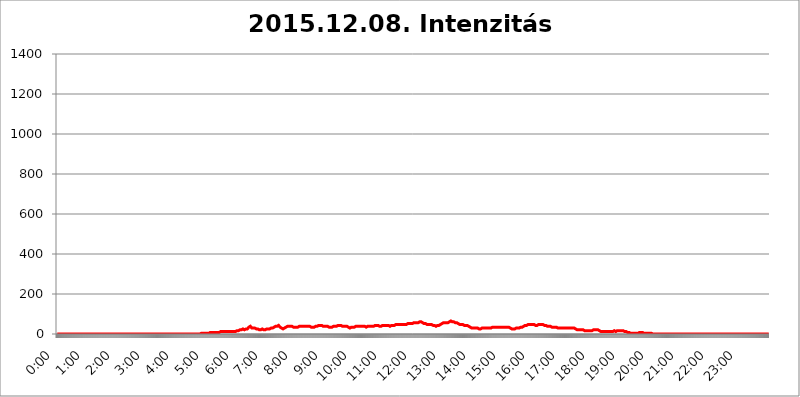
| Category | 2015.12.08. Intenzitás [W/m^2] |
|---|---|
| 0.0 | 0 |
| 0.0006944444444444445 | 0 |
| 0.001388888888888889 | 0 |
| 0.0020833333333333333 | 0 |
| 0.002777777777777778 | 0 |
| 0.003472222222222222 | 0 |
| 0.004166666666666667 | 0 |
| 0.004861111111111111 | 0 |
| 0.005555555555555556 | 0 |
| 0.0062499999999999995 | 0 |
| 0.006944444444444444 | 0 |
| 0.007638888888888889 | 0 |
| 0.008333333333333333 | 0 |
| 0.009027777777777779 | 0 |
| 0.009722222222222222 | 0 |
| 0.010416666666666666 | 0 |
| 0.011111111111111112 | 0 |
| 0.011805555555555555 | 0 |
| 0.012499999999999999 | 0 |
| 0.013194444444444444 | 0 |
| 0.013888888888888888 | 0 |
| 0.014583333333333332 | 0 |
| 0.015277777777777777 | 0 |
| 0.015972222222222224 | 0 |
| 0.016666666666666666 | 0 |
| 0.017361111111111112 | 0 |
| 0.018055555555555557 | 0 |
| 0.01875 | 0 |
| 0.019444444444444445 | 0 |
| 0.02013888888888889 | 0 |
| 0.020833333333333332 | 0 |
| 0.02152777777777778 | 0 |
| 0.022222222222222223 | 0 |
| 0.02291666666666667 | 0 |
| 0.02361111111111111 | 0 |
| 0.024305555555555556 | 0 |
| 0.024999999999999998 | 0 |
| 0.025694444444444447 | 0 |
| 0.02638888888888889 | 0 |
| 0.027083333333333334 | 0 |
| 0.027777777777777776 | 0 |
| 0.02847222222222222 | 0 |
| 0.029166666666666664 | 0 |
| 0.029861111111111113 | 0 |
| 0.030555555555555555 | 0 |
| 0.03125 | 0 |
| 0.03194444444444445 | 0 |
| 0.03263888888888889 | 0 |
| 0.03333333333333333 | 0 |
| 0.034027777777777775 | 0 |
| 0.034722222222222224 | 0 |
| 0.035416666666666666 | 0 |
| 0.036111111111111115 | 0 |
| 0.03680555555555556 | 0 |
| 0.0375 | 0 |
| 0.03819444444444444 | 0 |
| 0.03888888888888889 | 0 |
| 0.03958333333333333 | 0 |
| 0.04027777777777778 | 0 |
| 0.04097222222222222 | 0 |
| 0.041666666666666664 | 0 |
| 0.042361111111111106 | 0 |
| 0.04305555555555556 | 0 |
| 0.043750000000000004 | 0 |
| 0.044444444444444446 | 0 |
| 0.04513888888888889 | 0 |
| 0.04583333333333334 | 0 |
| 0.04652777777777778 | 0 |
| 0.04722222222222222 | 0 |
| 0.04791666666666666 | 0 |
| 0.04861111111111111 | 0 |
| 0.049305555555555554 | 0 |
| 0.049999999999999996 | 0 |
| 0.05069444444444445 | 0 |
| 0.051388888888888894 | 0 |
| 0.052083333333333336 | 0 |
| 0.05277777777777778 | 0 |
| 0.05347222222222222 | 0 |
| 0.05416666666666667 | 0 |
| 0.05486111111111111 | 0 |
| 0.05555555555555555 | 0 |
| 0.05625 | 0 |
| 0.05694444444444444 | 0 |
| 0.057638888888888885 | 0 |
| 0.05833333333333333 | 0 |
| 0.05902777777777778 | 0 |
| 0.059722222222222225 | 0 |
| 0.06041666666666667 | 0 |
| 0.061111111111111116 | 0 |
| 0.06180555555555556 | 0 |
| 0.0625 | 0 |
| 0.06319444444444444 | 0 |
| 0.06388888888888888 | 0 |
| 0.06458333333333334 | 0 |
| 0.06527777777777778 | 0 |
| 0.06597222222222222 | 0 |
| 0.06666666666666667 | 0 |
| 0.06736111111111111 | 0 |
| 0.06805555555555555 | 0 |
| 0.06874999999999999 | 0 |
| 0.06944444444444443 | 0 |
| 0.07013888888888889 | 0 |
| 0.07083333333333333 | 0 |
| 0.07152777777777779 | 0 |
| 0.07222222222222223 | 0 |
| 0.07291666666666667 | 0 |
| 0.07361111111111111 | 0 |
| 0.07430555555555556 | 0 |
| 0.075 | 0 |
| 0.07569444444444444 | 0 |
| 0.0763888888888889 | 0 |
| 0.07708333333333334 | 0 |
| 0.07777777777777778 | 0 |
| 0.07847222222222222 | 0 |
| 0.07916666666666666 | 0 |
| 0.0798611111111111 | 0 |
| 0.08055555555555556 | 0 |
| 0.08125 | 0 |
| 0.08194444444444444 | 0 |
| 0.08263888888888889 | 0 |
| 0.08333333333333333 | 0 |
| 0.08402777777777777 | 0 |
| 0.08472222222222221 | 0 |
| 0.08541666666666665 | 0 |
| 0.08611111111111112 | 0 |
| 0.08680555555555557 | 0 |
| 0.08750000000000001 | 0 |
| 0.08819444444444445 | 0 |
| 0.08888888888888889 | 0 |
| 0.08958333333333333 | 0 |
| 0.09027777777777778 | 0 |
| 0.09097222222222222 | 0 |
| 0.09166666666666667 | 0 |
| 0.09236111111111112 | 0 |
| 0.09305555555555556 | 0 |
| 0.09375 | 0 |
| 0.09444444444444444 | 0 |
| 0.09513888888888888 | 0 |
| 0.09583333333333333 | 0 |
| 0.09652777777777777 | 0 |
| 0.09722222222222222 | 0 |
| 0.09791666666666667 | 0 |
| 0.09861111111111111 | 0 |
| 0.09930555555555555 | 0 |
| 0.09999999999999999 | 0 |
| 0.10069444444444443 | 0 |
| 0.1013888888888889 | 0 |
| 0.10208333333333335 | 0 |
| 0.10277777777777779 | 0 |
| 0.10347222222222223 | 0 |
| 0.10416666666666667 | 0 |
| 0.10486111111111111 | 0 |
| 0.10555555555555556 | 0 |
| 0.10625 | 0 |
| 0.10694444444444444 | 0 |
| 0.1076388888888889 | 0 |
| 0.10833333333333334 | 0 |
| 0.10902777777777778 | 0 |
| 0.10972222222222222 | 0 |
| 0.1111111111111111 | 0 |
| 0.11180555555555556 | 0 |
| 0.11180555555555556 | 0 |
| 0.1125 | 0 |
| 0.11319444444444444 | 0 |
| 0.11388888888888889 | 0 |
| 0.11458333333333333 | 0 |
| 0.11527777777777777 | 0 |
| 0.11597222222222221 | 0 |
| 0.11666666666666665 | 0 |
| 0.1173611111111111 | 0 |
| 0.11805555555555557 | 0 |
| 0.11944444444444445 | 0 |
| 0.12013888888888889 | 0 |
| 0.12083333333333333 | 0 |
| 0.12152777777777778 | 0 |
| 0.12222222222222223 | 0 |
| 0.12291666666666667 | 0 |
| 0.12291666666666667 | 0 |
| 0.12361111111111112 | 0 |
| 0.12430555555555556 | 0 |
| 0.125 | 0 |
| 0.12569444444444444 | 0 |
| 0.12638888888888888 | 0 |
| 0.12708333333333333 | 0 |
| 0.16875 | 0 |
| 0.12847222222222224 | 0 |
| 0.12916666666666668 | 0 |
| 0.12986111111111112 | 0 |
| 0.13055555555555556 | 0 |
| 0.13125 | 0 |
| 0.13194444444444445 | 0 |
| 0.1326388888888889 | 0 |
| 0.13333333333333333 | 0 |
| 0.13402777777777777 | 0 |
| 0.13402777777777777 | 0 |
| 0.13472222222222222 | 0 |
| 0.13541666666666666 | 0 |
| 0.1361111111111111 | 0 |
| 0.13749999999999998 | 0 |
| 0.13819444444444443 | 0 |
| 0.1388888888888889 | 0 |
| 0.13958333333333334 | 0 |
| 0.14027777777777778 | 0 |
| 0.14097222222222222 | 0 |
| 0.14166666666666666 | 0 |
| 0.1423611111111111 | 0 |
| 0.14305555555555557 | 0 |
| 0.14375000000000002 | 0 |
| 0.14444444444444446 | 0 |
| 0.1451388888888889 | 0 |
| 0.1451388888888889 | 0 |
| 0.14652777777777778 | 0 |
| 0.14722222222222223 | 0 |
| 0.14791666666666667 | 0 |
| 0.1486111111111111 | 0 |
| 0.14930555555555555 | 0 |
| 0.15 | 0 |
| 0.15069444444444444 | 0 |
| 0.15138888888888888 | 0 |
| 0.15208333333333332 | 0 |
| 0.15277777777777776 | 0 |
| 0.15347222222222223 | 0 |
| 0.15416666666666667 | 0 |
| 0.15486111111111112 | 0 |
| 0.15555555555555556 | 0 |
| 0.15625 | 0 |
| 0.15694444444444444 | 0 |
| 0.15763888888888888 | 0 |
| 0.15833333333333333 | 0 |
| 0.15902777777777777 | 0 |
| 0.15972222222222224 | 0 |
| 0.16041666666666668 | 0 |
| 0.16111111111111112 | 0 |
| 0.16180555555555556 | 0 |
| 0.1625 | 0 |
| 0.16319444444444445 | 0 |
| 0.1638888888888889 | 0 |
| 0.16458333333333333 | 0 |
| 0.16527777777777777 | 0 |
| 0.16597222222222222 | 0 |
| 0.16666666666666666 | 0 |
| 0.1673611111111111 | 0 |
| 0.16805555555555554 | 0 |
| 0.16874999999999998 | 0 |
| 0.16944444444444443 | 0 |
| 0.17013888888888887 | 0 |
| 0.1708333333333333 | 0 |
| 0.17152777777777775 | 0 |
| 0.17222222222222225 | 0 |
| 0.1729166666666667 | 0 |
| 0.17361111111111113 | 0 |
| 0.17430555555555557 | 0 |
| 0.17500000000000002 | 0 |
| 0.17569444444444446 | 0 |
| 0.1763888888888889 | 0 |
| 0.17708333333333334 | 0 |
| 0.17777777777777778 | 0 |
| 0.17847222222222223 | 0 |
| 0.17916666666666667 | 0 |
| 0.1798611111111111 | 0 |
| 0.18055555555555555 | 0 |
| 0.18125 | 0 |
| 0.18194444444444444 | 0 |
| 0.1826388888888889 | 0 |
| 0.18333333333333335 | 0 |
| 0.1840277777777778 | 0 |
| 0.18472222222222223 | 0 |
| 0.18541666666666667 | 0 |
| 0.18611111111111112 | 0 |
| 0.18680555555555556 | 0 |
| 0.1875 | 0 |
| 0.18819444444444444 | 0 |
| 0.18888888888888888 | 0 |
| 0.18958333333333333 | 0 |
| 0.19027777777777777 | 0 |
| 0.1909722222222222 | 0 |
| 0.19166666666666665 | 0 |
| 0.19236111111111112 | 0 |
| 0.19305555555555554 | 0 |
| 0.19375 | 0 |
| 0.19444444444444445 | 0 |
| 0.1951388888888889 | 0 |
| 0.19583333333333333 | 0 |
| 0.19652777777777777 | 0 |
| 0.19722222222222222 | 0 |
| 0.19791666666666666 | 0 |
| 0.1986111111111111 | 0 |
| 0.19930555555555554 | 0 |
| 0.19999999999999998 | 0 |
| 0.20069444444444443 | 3.525 |
| 0.20138888888888887 | 3.525 |
| 0.2020833333333333 | 3.525 |
| 0.2027777777777778 | 3.525 |
| 0.2034722222222222 | 3.525 |
| 0.2041666666666667 | 3.525 |
| 0.20486111111111113 | 3.525 |
| 0.20555555555555557 | 3.525 |
| 0.20625000000000002 | 3.525 |
| 0.20694444444444446 | 3.525 |
| 0.2076388888888889 | 3.525 |
| 0.20833333333333334 | 3.525 |
| 0.20902777777777778 | 3.525 |
| 0.20972222222222223 | 3.525 |
| 0.21041666666666667 | 3.525 |
| 0.2111111111111111 | 3.525 |
| 0.21180555555555555 | 3.525 |
| 0.2125 | 3.525 |
| 0.21319444444444444 | 7.887 |
| 0.2138888888888889 | 3.525 |
| 0.21458333333333335 | 7.887 |
| 0.2152777777777778 | 3.525 |
| 0.21597222222222223 | 7.887 |
| 0.21666666666666667 | 7.887 |
| 0.21736111111111112 | 7.887 |
| 0.21805555555555556 | 7.887 |
| 0.21875 | 7.887 |
| 0.21944444444444444 | 7.887 |
| 0.22013888888888888 | 7.887 |
| 0.22083333333333333 | 7.887 |
| 0.22152777777777777 | 7.887 |
| 0.2222222222222222 | 7.887 |
| 0.22291666666666665 | 7.887 |
| 0.2236111111111111 | 7.887 |
| 0.22430555555555556 | 7.887 |
| 0.225 | 7.887 |
| 0.22569444444444445 | 7.887 |
| 0.2263888888888889 | 7.887 |
| 0.22708333333333333 | 7.887 |
| 0.22777777777777777 | 7.887 |
| 0.22847222222222222 | 12.257 |
| 0.22916666666666666 | 12.257 |
| 0.2298611111111111 | 12.257 |
| 0.23055555555555554 | 12.257 |
| 0.23124999999999998 | 12.257 |
| 0.23194444444444443 | 12.257 |
| 0.23263888888888887 | 12.257 |
| 0.2333333333333333 | 12.257 |
| 0.2340277777777778 | 12.257 |
| 0.2347222222222222 | 12.257 |
| 0.2354166666666667 | 12.257 |
| 0.23611111111111113 | 12.257 |
| 0.23680555555555557 | 12.257 |
| 0.23750000000000002 | 12.257 |
| 0.23819444444444446 | 12.257 |
| 0.2388888888888889 | 12.257 |
| 0.23958333333333334 | 12.257 |
| 0.24027777777777778 | 12.257 |
| 0.24097222222222223 | 12.257 |
| 0.24166666666666667 | 12.257 |
| 0.2423611111111111 | 12.257 |
| 0.24305555555555555 | 12.257 |
| 0.24375 | 12.257 |
| 0.24444444444444446 | 12.257 |
| 0.24513888888888888 | 12.257 |
| 0.24583333333333335 | 12.257 |
| 0.2465277777777778 | 12.257 |
| 0.24722222222222223 | 12.257 |
| 0.24791666666666667 | 12.257 |
| 0.24861111111111112 | 12.257 |
| 0.24930555555555556 | 12.257 |
| 0.25 | 12.257 |
| 0.25069444444444444 | 16.636 |
| 0.2513888888888889 | 16.636 |
| 0.2520833333333333 | 16.636 |
| 0.25277777777777777 | 16.636 |
| 0.2534722222222222 | 16.636 |
| 0.25416666666666665 | 16.636 |
| 0.2548611111111111 | 16.636 |
| 0.2555555555555556 | 21.024 |
| 0.25625000000000003 | 21.024 |
| 0.2569444444444445 | 21.024 |
| 0.2576388888888889 | 21.024 |
| 0.25833333333333336 | 21.024 |
| 0.2590277777777778 | 25.419 |
| 0.25972222222222224 | 25.419 |
| 0.2604166666666667 | 25.419 |
| 0.2611111111111111 | 25.419 |
| 0.26180555555555557 | 25.419 |
| 0.2625 | 21.024 |
| 0.26319444444444445 | 25.419 |
| 0.2638888888888889 | 25.419 |
| 0.26458333333333334 | 25.419 |
| 0.2652777777777778 | 25.419 |
| 0.2659722222222222 | 25.419 |
| 0.26666666666666666 | 25.419 |
| 0.2673611111111111 | 29.823 |
| 0.26805555555555555 | 29.823 |
| 0.26875 | 34.234 |
| 0.26944444444444443 | 34.234 |
| 0.2701388888888889 | 34.234 |
| 0.2708333333333333 | 38.653 |
| 0.27152777777777776 | 38.653 |
| 0.2722222222222222 | 34.234 |
| 0.27291666666666664 | 29.823 |
| 0.2736111111111111 | 29.823 |
| 0.2743055555555555 | 29.823 |
| 0.27499999999999997 | 29.823 |
| 0.27569444444444446 | 29.823 |
| 0.27638888888888885 | 29.823 |
| 0.27708333333333335 | 29.823 |
| 0.2777777777777778 | 29.823 |
| 0.27847222222222223 | 29.823 |
| 0.2791666666666667 | 25.419 |
| 0.2798611111111111 | 25.419 |
| 0.28055555555555556 | 25.419 |
| 0.28125 | 25.419 |
| 0.28194444444444444 | 25.419 |
| 0.2826388888888889 | 25.419 |
| 0.2833333333333333 | 21.024 |
| 0.28402777777777777 | 21.024 |
| 0.2847222222222222 | 21.024 |
| 0.28541666666666665 | 21.024 |
| 0.28611111111111115 | 21.024 |
| 0.28680555555555554 | 25.419 |
| 0.28750000000000003 | 25.419 |
| 0.2881944444444445 | 25.419 |
| 0.2888888888888889 | 21.024 |
| 0.28958333333333336 | 21.024 |
| 0.2902777777777778 | 21.024 |
| 0.29097222222222224 | 21.024 |
| 0.2916666666666667 | 21.024 |
| 0.2923611111111111 | 25.419 |
| 0.29305555555555557 | 25.419 |
| 0.29375 | 25.419 |
| 0.29444444444444445 | 25.419 |
| 0.2951388888888889 | 25.419 |
| 0.29583333333333334 | 25.419 |
| 0.2965277777777778 | 25.419 |
| 0.2972222222222222 | 25.419 |
| 0.29791666666666666 | 25.419 |
| 0.2986111111111111 | 29.823 |
| 0.29930555555555555 | 29.823 |
| 0.3 | 29.823 |
| 0.30069444444444443 | 29.823 |
| 0.3013888888888889 | 29.823 |
| 0.3020833333333333 | 29.823 |
| 0.30277777777777776 | 29.823 |
| 0.3034722222222222 | 34.234 |
| 0.30416666666666664 | 34.234 |
| 0.3048611111111111 | 38.653 |
| 0.3055555555555555 | 38.653 |
| 0.30624999999999997 | 38.653 |
| 0.3069444444444444 | 38.653 |
| 0.3076388888888889 | 38.653 |
| 0.30833333333333335 | 38.653 |
| 0.3090277777777778 | 43.079 |
| 0.30972222222222223 | 43.079 |
| 0.3104166666666667 | 43.079 |
| 0.3111111111111111 | 38.653 |
| 0.31180555555555556 | 38.653 |
| 0.3125 | 34.234 |
| 0.31319444444444444 | 29.823 |
| 0.3138888888888889 | 29.823 |
| 0.3145833333333333 | 29.823 |
| 0.31527777777777777 | 29.823 |
| 0.3159722222222222 | 25.419 |
| 0.31666666666666665 | 25.419 |
| 0.31736111111111115 | 25.419 |
| 0.31805555555555554 | 29.823 |
| 0.31875000000000003 | 29.823 |
| 0.3194444444444445 | 29.823 |
| 0.3201388888888889 | 34.234 |
| 0.32083333333333336 | 34.234 |
| 0.3215277777777778 | 34.234 |
| 0.32222222222222224 | 38.653 |
| 0.3229166666666667 | 38.653 |
| 0.3236111111111111 | 38.653 |
| 0.32430555555555557 | 38.653 |
| 0.325 | 38.653 |
| 0.32569444444444445 | 38.653 |
| 0.3263888888888889 | 38.653 |
| 0.32708333333333334 | 38.653 |
| 0.3277777777777778 | 38.653 |
| 0.3284722222222222 | 38.653 |
| 0.32916666666666666 | 38.653 |
| 0.3298611111111111 | 38.653 |
| 0.33055555555555555 | 34.234 |
| 0.33125 | 34.234 |
| 0.33194444444444443 | 34.234 |
| 0.3326388888888889 | 38.653 |
| 0.3333333333333333 | 34.234 |
| 0.3340277777777778 | 34.234 |
| 0.3347222222222222 | 34.234 |
| 0.3354166666666667 | 34.234 |
| 0.3361111111111111 | 34.234 |
| 0.3368055555555556 | 34.234 |
| 0.33749999999999997 | 34.234 |
| 0.33819444444444446 | 38.653 |
| 0.33888888888888885 | 38.653 |
| 0.33958333333333335 | 38.653 |
| 0.34027777777777773 | 38.653 |
| 0.34097222222222223 | 38.653 |
| 0.3416666666666666 | 38.653 |
| 0.3423611111111111 | 38.653 |
| 0.3430555555555555 | 38.653 |
| 0.34375 | 38.653 |
| 0.3444444444444445 | 38.653 |
| 0.3451388888888889 | 34.234 |
| 0.3458333333333334 | 38.653 |
| 0.34652777777777777 | 38.653 |
| 0.34722222222222227 | 38.653 |
| 0.34791666666666665 | 38.653 |
| 0.34861111111111115 | 38.653 |
| 0.34930555555555554 | 38.653 |
| 0.35000000000000003 | 38.653 |
| 0.3506944444444444 | 38.653 |
| 0.3513888888888889 | 38.653 |
| 0.3520833333333333 | 38.653 |
| 0.3527777777777778 | 38.653 |
| 0.3534722222222222 | 38.653 |
| 0.3541666666666667 | 38.653 |
| 0.3548611111111111 | 38.653 |
| 0.35555555555555557 | 38.653 |
| 0.35625 | 34.234 |
| 0.35694444444444445 | 34.234 |
| 0.3576388888888889 | 34.234 |
| 0.35833333333333334 | 34.234 |
| 0.3590277777777778 | 34.234 |
| 0.3597222222222222 | 34.234 |
| 0.36041666666666666 | 34.234 |
| 0.3611111111111111 | 34.234 |
| 0.36180555555555555 | 38.653 |
| 0.3625 | 38.653 |
| 0.36319444444444443 | 38.653 |
| 0.3638888888888889 | 38.653 |
| 0.3645833333333333 | 38.653 |
| 0.3652777777777778 | 38.653 |
| 0.3659722222222222 | 43.079 |
| 0.3666666666666667 | 43.079 |
| 0.3673611111111111 | 43.079 |
| 0.3680555555555556 | 43.079 |
| 0.36874999999999997 | 43.079 |
| 0.36944444444444446 | 43.079 |
| 0.37013888888888885 | 43.079 |
| 0.37083333333333335 | 43.079 |
| 0.37152777777777773 | 38.653 |
| 0.37222222222222223 | 38.653 |
| 0.3729166666666666 | 38.653 |
| 0.3736111111111111 | 38.653 |
| 0.3743055555555555 | 38.653 |
| 0.375 | 38.653 |
| 0.3756944444444445 | 38.653 |
| 0.3763888888888889 | 38.653 |
| 0.3770833333333334 | 38.653 |
| 0.37777777777777777 | 38.653 |
| 0.37847222222222227 | 38.653 |
| 0.37916666666666665 | 38.653 |
| 0.37986111111111115 | 38.653 |
| 0.38055555555555554 | 38.653 |
| 0.38125000000000003 | 34.234 |
| 0.3819444444444444 | 34.234 |
| 0.3826388888888889 | 34.234 |
| 0.3833333333333333 | 34.234 |
| 0.3840277777777778 | 34.234 |
| 0.3847222222222222 | 34.234 |
| 0.3854166666666667 | 34.234 |
| 0.3861111111111111 | 34.234 |
| 0.38680555555555557 | 34.234 |
| 0.3875 | 38.653 |
| 0.38819444444444445 | 38.653 |
| 0.3888888888888889 | 38.653 |
| 0.38958333333333334 | 38.653 |
| 0.3902777777777778 | 38.653 |
| 0.3909722222222222 | 38.653 |
| 0.39166666666666666 | 38.653 |
| 0.3923611111111111 | 38.653 |
| 0.39305555555555555 | 38.653 |
| 0.39375 | 43.079 |
| 0.39444444444444443 | 43.079 |
| 0.3951388888888889 | 47.511 |
| 0.3958333333333333 | 43.079 |
| 0.3965277777777778 | 43.079 |
| 0.3972222222222222 | 43.079 |
| 0.3979166666666667 | 43.079 |
| 0.3986111111111111 | 43.079 |
| 0.3993055555555556 | 43.079 |
| 0.39999999999999997 | 38.653 |
| 0.40069444444444446 | 38.653 |
| 0.40138888888888885 | 38.653 |
| 0.40208333333333335 | 38.653 |
| 0.40277777777777773 | 38.653 |
| 0.40347222222222223 | 38.653 |
| 0.4041666666666666 | 38.653 |
| 0.4048611111111111 | 38.653 |
| 0.4055555555555555 | 38.653 |
| 0.40625 | 38.653 |
| 0.4069444444444445 | 34.234 |
| 0.4076388888888889 | 34.234 |
| 0.4083333333333334 | 34.234 |
| 0.40902777777777777 | 34.234 |
| 0.40972222222222227 | 34.234 |
| 0.41041666666666665 | 29.823 |
| 0.41111111111111115 | 29.823 |
| 0.41180555555555554 | 29.823 |
| 0.41250000000000003 | 34.234 |
| 0.4131944444444444 | 34.234 |
| 0.4138888888888889 | 34.234 |
| 0.4145833333333333 | 34.234 |
| 0.4152777777777778 | 34.234 |
| 0.4159722222222222 | 34.234 |
| 0.4166666666666667 | 34.234 |
| 0.4173611111111111 | 34.234 |
| 0.41805555555555557 | 38.653 |
| 0.41875 | 38.653 |
| 0.41944444444444445 | 38.653 |
| 0.4201388888888889 | 38.653 |
| 0.42083333333333334 | 38.653 |
| 0.4215277777777778 | 38.653 |
| 0.4222222222222222 | 38.653 |
| 0.42291666666666666 | 38.653 |
| 0.4236111111111111 | 38.653 |
| 0.42430555555555555 | 38.653 |
| 0.425 | 38.653 |
| 0.42569444444444443 | 38.653 |
| 0.4263888888888889 | 38.653 |
| 0.4270833333333333 | 38.653 |
| 0.4277777777777778 | 38.653 |
| 0.4284722222222222 | 38.653 |
| 0.4291666666666667 | 38.653 |
| 0.4298611111111111 | 38.653 |
| 0.4305555555555556 | 38.653 |
| 0.43124999999999997 | 38.653 |
| 0.43194444444444446 | 38.653 |
| 0.43263888888888885 | 34.234 |
| 0.43333333333333335 | 34.234 |
| 0.43402777777777773 | 34.234 |
| 0.43472222222222223 | 34.234 |
| 0.4354166666666666 | 38.653 |
| 0.4361111111111111 | 38.653 |
| 0.4368055555555555 | 38.653 |
| 0.4375 | 38.653 |
| 0.4381944444444445 | 38.653 |
| 0.4388888888888889 | 38.653 |
| 0.4395833333333334 | 38.653 |
| 0.44027777777777777 | 38.653 |
| 0.44097222222222227 | 38.653 |
| 0.44166666666666665 | 38.653 |
| 0.44236111111111115 | 38.653 |
| 0.44305555555555554 | 38.653 |
| 0.44375000000000003 | 38.653 |
| 0.4444444444444444 | 38.653 |
| 0.4451388888888889 | 38.653 |
| 0.4458333333333333 | 43.079 |
| 0.4465277777777778 | 43.079 |
| 0.4472222222222222 | 43.079 |
| 0.4479166666666667 | 43.079 |
| 0.4486111111111111 | 43.079 |
| 0.44930555555555557 | 43.079 |
| 0.45 | 43.079 |
| 0.45069444444444445 | 43.079 |
| 0.4513888888888889 | 43.079 |
| 0.45208333333333334 | 38.653 |
| 0.4527777777777778 | 38.653 |
| 0.4534722222222222 | 38.653 |
| 0.45416666666666666 | 38.653 |
| 0.4548611111111111 | 38.653 |
| 0.45555555555555555 | 38.653 |
| 0.45625 | 43.079 |
| 0.45694444444444443 | 43.079 |
| 0.4576388888888889 | 43.079 |
| 0.4583333333333333 | 43.079 |
| 0.4590277777777778 | 43.079 |
| 0.4597222222222222 | 43.079 |
| 0.4604166666666667 | 43.079 |
| 0.4611111111111111 | 43.079 |
| 0.4618055555555556 | 43.079 |
| 0.46249999999999997 | 43.079 |
| 0.46319444444444446 | 43.079 |
| 0.46388888888888885 | 43.079 |
| 0.46458333333333335 | 43.079 |
| 0.46527777777777773 | 43.079 |
| 0.46597222222222223 | 43.079 |
| 0.4666666666666666 | 38.653 |
| 0.4673611111111111 | 43.079 |
| 0.4680555555555555 | 43.079 |
| 0.46875 | 43.079 |
| 0.4694444444444445 | 43.079 |
| 0.4701388888888889 | 43.079 |
| 0.4708333333333334 | 43.079 |
| 0.47152777777777777 | 43.079 |
| 0.47222222222222227 | 43.079 |
| 0.47291666666666665 | 43.079 |
| 0.47361111111111115 | 43.079 |
| 0.47430555555555554 | 47.511 |
| 0.47500000000000003 | 47.511 |
| 0.4756944444444444 | 47.511 |
| 0.4763888888888889 | 47.511 |
| 0.4770833333333333 | 47.511 |
| 0.4777777777777778 | 47.511 |
| 0.4784722222222222 | 47.511 |
| 0.4791666666666667 | 47.511 |
| 0.4798611111111111 | 47.511 |
| 0.48055555555555557 | 47.511 |
| 0.48125 | 47.511 |
| 0.48194444444444445 | 47.511 |
| 0.4826388888888889 | 47.511 |
| 0.48333333333333334 | 47.511 |
| 0.4840277777777778 | 47.511 |
| 0.4847222222222222 | 47.511 |
| 0.48541666666666666 | 47.511 |
| 0.4861111111111111 | 47.511 |
| 0.48680555555555555 | 47.511 |
| 0.4875 | 47.511 |
| 0.48819444444444443 | 47.511 |
| 0.4888888888888889 | 47.511 |
| 0.4895833333333333 | 47.511 |
| 0.4902777777777778 | 47.511 |
| 0.4909722222222222 | 51.951 |
| 0.4916666666666667 | 51.951 |
| 0.4923611111111111 | 51.951 |
| 0.4930555555555556 | 51.951 |
| 0.49374999999999997 | 51.951 |
| 0.49444444444444446 | 51.951 |
| 0.49513888888888885 | 51.951 |
| 0.49583333333333335 | 51.951 |
| 0.49652777777777773 | 51.951 |
| 0.49722222222222223 | 51.951 |
| 0.4979166666666666 | 51.951 |
| 0.4986111111111111 | 51.951 |
| 0.4993055555555555 | 56.398 |
| 0.5 | 56.398 |
| 0.5006944444444444 | 56.398 |
| 0.5013888888888889 | 56.398 |
| 0.5020833333333333 | 56.398 |
| 0.5027777777777778 | 56.398 |
| 0.5034722222222222 | 56.398 |
| 0.5041666666666667 | 56.398 |
| 0.5048611111111111 | 56.398 |
| 0.5055555555555555 | 56.398 |
| 0.50625 | 56.398 |
| 0.5069444444444444 | 60.85 |
| 0.5076388888888889 | 60.85 |
| 0.5083333333333333 | 60.85 |
| 0.5090277777777777 | 60.85 |
| 0.5097222222222222 | 60.85 |
| 0.5104166666666666 | 60.85 |
| 0.5111111111111112 | 60.85 |
| 0.5118055555555555 | 60.85 |
| 0.5125000000000001 | 56.398 |
| 0.5131944444444444 | 56.398 |
| 0.513888888888889 | 51.951 |
| 0.5145833333333333 | 51.951 |
| 0.5152777777777778 | 51.951 |
| 0.5159722222222222 | 51.951 |
| 0.5166666666666667 | 51.951 |
| 0.517361111111111 | 51.951 |
| 0.5180555555555556 | 47.511 |
| 0.5187499999999999 | 47.511 |
| 0.5194444444444445 | 47.511 |
| 0.5201388888888888 | 47.511 |
| 0.5208333333333334 | 47.511 |
| 0.5215277777777778 | 47.511 |
| 0.5222222222222223 | 47.511 |
| 0.5229166666666667 | 47.511 |
| 0.5236111111111111 | 47.511 |
| 0.5243055555555556 | 47.511 |
| 0.525 | 47.511 |
| 0.5256944444444445 | 47.511 |
| 0.5263888888888889 | 47.511 |
| 0.5270833333333333 | 43.079 |
| 0.5277777777777778 | 43.079 |
| 0.5284722222222222 | 43.079 |
| 0.5291666666666667 | 43.079 |
| 0.5298611111111111 | 43.079 |
| 0.5305555555555556 | 38.653 |
| 0.53125 | 38.653 |
| 0.5319444444444444 | 38.653 |
| 0.5326388888888889 | 38.653 |
| 0.5333333333333333 | 43.079 |
| 0.5340277777777778 | 43.079 |
| 0.5347222222222222 | 43.079 |
| 0.5354166666666667 | 43.079 |
| 0.5361111111111111 | 43.079 |
| 0.5368055555555555 | 47.511 |
| 0.5375 | 47.511 |
| 0.5381944444444444 | 47.511 |
| 0.5388888888888889 | 51.951 |
| 0.5395833333333333 | 51.951 |
| 0.5402777777777777 | 56.398 |
| 0.5409722222222222 | 56.398 |
| 0.5416666666666666 | 56.398 |
| 0.5423611111111112 | 56.398 |
| 0.5430555555555555 | 56.398 |
| 0.5437500000000001 | 56.398 |
| 0.5444444444444444 | 56.398 |
| 0.545138888888889 | 56.398 |
| 0.5458333333333333 | 56.398 |
| 0.5465277777777778 | 56.398 |
| 0.5472222222222222 | 56.398 |
| 0.5479166666666667 | 56.398 |
| 0.548611111111111 | 60.85 |
| 0.5493055555555556 | 60.85 |
| 0.5499999999999999 | 60.85 |
| 0.5506944444444445 | 65.31 |
| 0.5513888888888888 | 65.31 |
| 0.5520833333333334 | 65.31 |
| 0.5527777777777778 | 65.31 |
| 0.5534722222222223 | 65.31 |
| 0.5541666666666667 | 60.85 |
| 0.5548611111111111 | 60.85 |
| 0.5555555555555556 | 60.85 |
| 0.55625 | 60.85 |
| 0.5569444444444445 | 56.398 |
| 0.5576388888888889 | 56.398 |
| 0.5583333333333333 | 56.398 |
| 0.5590277777777778 | 56.398 |
| 0.5597222222222222 | 56.398 |
| 0.5604166666666667 | 56.398 |
| 0.5611111111111111 | 56.398 |
| 0.5618055555555556 | 56.398 |
| 0.5625 | 51.951 |
| 0.5631944444444444 | 51.951 |
| 0.5638888888888889 | 51.951 |
| 0.5645833333333333 | 47.511 |
| 0.5652777777777778 | 47.511 |
| 0.5659722222222222 | 47.511 |
| 0.5666666666666667 | 47.511 |
| 0.5673611111111111 | 47.511 |
| 0.5680555555555555 | 47.511 |
| 0.56875 | 47.511 |
| 0.5694444444444444 | 43.079 |
| 0.5701388888888889 | 43.079 |
| 0.5708333333333333 | 43.079 |
| 0.5715277777777777 | 43.079 |
| 0.5722222222222222 | 43.079 |
| 0.5729166666666666 | 43.079 |
| 0.5736111111111112 | 43.079 |
| 0.5743055555555555 | 43.079 |
| 0.5750000000000001 | 43.079 |
| 0.5756944444444444 | 43.079 |
| 0.576388888888889 | 38.653 |
| 0.5770833333333333 | 38.653 |
| 0.5777777777777778 | 38.653 |
| 0.5784722222222222 | 34.234 |
| 0.5791666666666667 | 34.234 |
| 0.579861111111111 | 34.234 |
| 0.5805555555555556 | 29.823 |
| 0.5812499999999999 | 29.823 |
| 0.5819444444444445 | 29.823 |
| 0.5826388888888888 | 29.823 |
| 0.5833333333333334 | 29.823 |
| 0.5840277777777778 | 29.823 |
| 0.5847222222222223 | 29.823 |
| 0.5854166666666667 | 29.823 |
| 0.5861111111111111 | 29.823 |
| 0.5868055555555556 | 29.823 |
| 0.5875 | 29.823 |
| 0.5881944444444445 | 29.823 |
| 0.5888888888888889 | 29.823 |
| 0.5895833333333333 | 29.823 |
| 0.5902777777777778 | 29.823 |
| 0.5909722222222222 | 29.823 |
| 0.5916666666666667 | 25.419 |
| 0.5923611111111111 | 25.419 |
| 0.5930555555555556 | 29.823 |
| 0.59375 | 25.419 |
| 0.5944444444444444 | 29.823 |
| 0.5951388888888889 | 29.823 |
| 0.5958333333333333 | 29.823 |
| 0.5965277777777778 | 29.823 |
| 0.5972222222222222 | 29.823 |
| 0.5979166666666667 | 29.823 |
| 0.5986111111111111 | 29.823 |
| 0.5993055555555555 | 29.823 |
| 0.6 | 29.823 |
| 0.6006944444444444 | 29.823 |
| 0.6013888888888889 | 29.823 |
| 0.6020833333333333 | 29.823 |
| 0.6027777777777777 | 29.823 |
| 0.6034722222222222 | 29.823 |
| 0.6041666666666666 | 29.823 |
| 0.6048611111111112 | 29.823 |
| 0.6055555555555555 | 29.823 |
| 0.6062500000000001 | 29.823 |
| 0.6069444444444444 | 29.823 |
| 0.607638888888889 | 29.823 |
| 0.6083333333333333 | 29.823 |
| 0.6090277777777778 | 29.823 |
| 0.6097222222222222 | 34.234 |
| 0.6104166666666667 | 34.234 |
| 0.611111111111111 | 34.234 |
| 0.6118055555555556 | 34.234 |
| 0.6124999999999999 | 34.234 |
| 0.6131944444444445 | 34.234 |
| 0.6138888888888888 | 34.234 |
| 0.6145833333333334 | 34.234 |
| 0.6152777777777778 | 34.234 |
| 0.6159722222222223 | 34.234 |
| 0.6166666666666667 | 34.234 |
| 0.6173611111111111 | 34.234 |
| 0.6180555555555556 | 34.234 |
| 0.61875 | 34.234 |
| 0.6194444444444445 | 34.234 |
| 0.6201388888888889 | 34.234 |
| 0.6208333333333333 | 34.234 |
| 0.6215277777777778 | 34.234 |
| 0.6222222222222222 | 34.234 |
| 0.6229166666666667 | 34.234 |
| 0.6236111111111111 | 34.234 |
| 0.6243055555555556 | 34.234 |
| 0.625 | 34.234 |
| 0.6256944444444444 | 34.234 |
| 0.6263888888888889 | 34.234 |
| 0.6270833333333333 | 34.234 |
| 0.6277777777777778 | 34.234 |
| 0.6284722222222222 | 34.234 |
| 0.6291666666666667 | 34.234 |
| 0.6298611111111111 | 34.234 |
| 0.6305555555555555 | 34.234 |
| 0.63125 | 34.234 |
| 0.6319444444444444 | 34.234 |
| 0.6326388888888889 | 34.234 |
| 0.6333333333333333 | 34.234 |
| 0.6340277777777777 | 29.823 |
| 0.6347222222222222 | 29.823 |
| 0.6354166666666666 | 29.823 |
| 0.6361111111111112 | 29.823 |
| 0.6368055555555555 | 25.419 |
| 0.6375000000000001 | 25.419 |
| 0.6381944444444444 | 29.823 |
| 0.638888888888889 | 25.419 |
| 0.6395833333333333 | 25.419 |
| 0.6402777777777778 | 25.419 |
| 0.6409722222222222 | 25.419 |
| 0.6416666666666667 | 25.419 |
| 0.642361111111111 | 29.823 |
| 0.6430555555555556 | 29.823 |
| 0.6437499999999999 | 29.823 |
| 0.6444444444444445 | 29.823 |
| 0.6451388888888888 | 29.823 |
| 0.6458333333333334 | 29.823 |
| 0.6465277777777778 | 29.823 |
| 0.6472222222222223 | 29.823 |
| 0.6479166666666667 | 29.823 |
| 0.6486111111111111 | 29.823 |
| 0.6493055555555556 | 34.234 |
| 0.65 | 34.234 |
| 0.6506944444444445 | 34.234 |
| 0.6513888888888889 | 34.234 |
| 0.6520833333333333 | 34.234 |
| 0.6527777777777778 | 38.653 |
| 0.6534722222222222 | 38.653 |
| 0.6541666666666667 | 38.653 |
| 0.6548611111111111 | 43.079 |
| 0.6555555555555556 | 43.079 |
| 0.65625 | 43.079 |
| 0.6569444444444444 | 43.079 |
| 0.6576388888888889 | 43.079 |
| 0.6583333333333333 | 43.079 |
| 0.6590277777777778 | 43.079 |
| 0.6597222222222222 | 47.511 |
| 0.6604166666666667 | 47.511 |
| 0.6611111111111111 | 47.511 |
| 0.6618055555555555 | 47.511 |
| 0.6625 | 47.511 |
| 0.6631944444444444 | 47.511 |
| 0.6638888888888889 | 47.511 |
| 0.6645833333333333 | 47.511 |
| 0.6652777777777777 | 47.511 |
| 0.6659722222222222 | 47.511 |
| 0.6666666666666666 | 47.511 |
| 0.6673611111111111 | 47.511 |
| 0.6680555555555556 | 47.511 |
| 0.6687500000000001 | 47.511 |
| 0.6694444444444444 | 47.511 |
| 0.6701388888888888 | 43.079 |
| 0.6708333333333334 | 43.079 |
| 0.6715277777777778 | 43.079 |
| 0.6722222222222222 | 43.079 |
| 0.6729166666666666 | 43.079 |
| 0.6736111111111112 | 43.079 |
| 0.6743055555555556 | 43.079 |
| 0.6749999999999999 | 47.511 |
| 0.6756944444444444 | 47.511 |
| 0.6763888888888889 | 47.511 |
| 0.6770833333333334 | 47.511 |
| 0.6777777777777777 | 47.511 |
| 0.6784722222222223 | 47.511 |
| 0.6791666666666667 | 47.511 |
| 0.6798611111111111 | 47.511 |
| 0.6805555555555555 | 47.511 |
| 0.68125 | 47.511 |
| 0.6819444444444445 | 43.079 |
| 0.6826388888888889 | 43.079 |
| 0.6833333333333332 | 43.079 |
| 0.6840277777777778 | 43.079 |
| 0.6847222222222222 | 38.653 |
| 0.6854166666666667 | 43.079 |
| 0.686111111111111 | 38.653 |
| 0.6868055555555556 | 38.653 |
| 0.6875 | 38.653 |
| 0.6881944444444444 | 38.653 |
| 0.688888888888889 | 38.653 |
| 0.6895833333333333 | 38.653 |
| 0.6902777777777778 | 38.653 |
| 0.6909722222222222 | 38.653 |
| 0.6916666666666668 | 38.653 |
| 0.6923611111111111 | 38.653 |
| 0.6930555555555555 | 34.234 |
| 0.69375 | 34.234 |
| 0.6944444444444445 | 34.234 |
| 0.6951388888888889 | 34.234 |
| 0.6958333333333333 | 34.234 |
| 0.6965277777777777 | 34.234 |
| 0.6972222222222223 | 34.234 |
| 0.6979166666666666 | 34.234 |
| 0.6986111111111111 | 34.234 |
| 0.6993055555555556 | 29.823 |
| 0.7000000000000001 | 34.234 |
| 0.7006944444444444 | 34.234 |
| 0.7013888888888888 | 34.234 |
| 0.7020833333333334 | 29.823 |
| 0.7027777777777778 | 29.823 |
| 0.7034722222222222 | 29.823 |
| 0.7041666666666666 | 29.823 |
| 0.7048611111111112 | 29.823 |
| 0.7055555555555556 | 29.823 |
| 0.7062499999999999 | 29.823 |
| 0.7069444444444444 | 29.823 |
| 0.7076388888888889 | 29.823 |
| 0.7083333333333334 | 29.823 |
| 0.7090277777777777 | 29.823 |
| 0.7097222222222223 | 29.823 |
| 0.7104166666666667 | 29.823 |
| 0.7111111111111111 | 29.823 |
| 0.7118055555555555 | 29.823 |
| 0.7125 | 29.823 |
| 0.7131944444444445 | 29.823 |
| 0.7138888888888889 | 29.823 |
| 0.7145833333333332 | 29.823 |
| 0.7152777777777778 | 29.823 |
| 0.7159722222222222 | 29.823 |
| 0.7166666666666667 | 29.823 |
| 0.717361111111111 | 29.823 |
| 0.7180555555555556 | 29.823 |
| 0.71875 | 29.823 |
| 0.7194444444444444 | 25.419 |
| 0.720138888888889 | 25.419 |
| 0.7208333333333333 | 29.823 |
| 0.7215277777777778 | 29.823 |
| 0.7222222222222222 | 29.823 |
| 0.7229166666666668 | 29.823 |
| 0.7236111111111111 | 29.823 |
| 0.7243055555555555 | 29.823 |
| 0.725 | 29.823 |
| 0.7256944444444445 | 25.419 |
| 0.7263888888888889 | 25.419 |
| 0.7270833333333333 | 25.419 |
| 0.7277777777777777 | 25.419 |
| 0.7284722222222223 | 25.419 |
| 0.7291666666666666 | 21.024 |
| 0.7298611111111111 | 21.024 |
| 0.7305555555555556 | 21.024 |
| 0.7312500000000001 | 21.024 |
| 0.7319444444444444 | 21.024 |
| 0.7326388888888888 | 21.024 |
| 0.7333333333333334 | 21.024 |
| 0.7340277777777778 | 21.024 |
| 0.7347222222222222 | 21.024 |
| 0.7354166666666666 | 21.024 |
| 0.7361111111111112 | 21.024 |
| 0.7368055555555556 | 21.024 |
| 0.7374999999999999 | 21.024 |
| 0.7381944444444444 | 16.636 |
| 0.7388888888888889 | 16.636 |
| 0.7395833333333334 | 16.636 |
| 0.7402777777777777 | 16.636 |
| 0.7409722222222223 | 16.636 |
| 0.7416666666666667 | 16.636 |
| 0.7423611111111111 | 21.024 |
| 0.7430555555555555 | 16.636 |
| 0.74375 | 16.636 |
| 0.7444444444444445 | 16.636 |
| 0.7451388888888889 | 16.636 |
| 0.7458333333333332 | 16.636 |
| 0.7465277777777778 | 16.636 |
| 0.7472222222222222 | 16.636 |
| 0.7479166666666667 | 16.636 |
| 0.748611111111111 | 21.024 |
| 0.7493055555555556 | 21.024 |
| 0.75 | 16.636 |
| 0.7506944444444444 | 21.024 |
| 0.751388888888889 | 21.024 |
| 0.7520833333333333 | 21.024 |
| 0.7527777777777778 | 21.024 |
| 0.7534722222222222 | 21.024 |
| 0.7541666666666668 | 21.024 |
| 0.7548611111111111 | 21.024 |
| 0.7555555555555555 | 21.024 |
| 0.75625 | 21.024 |
| 0.7569444444444445 | 21.024 |
| 0.7576388888888889 | 21.024 |
| 0.7583333333333333 | 21.024 |
| 0.7590277777777777 | 16.636 |
| 0.7597222222222223 | 16.636 |
| 0.7604166666666666 | 16.636 |
| 0.7611111111111111 | 12.257 |
| 0.7618055555555556 | 12.257 |
| 0.7625000000000001 | 12.257 |
| 0.7631944444444444 | 12.257 |
| 0.7638888888888888 | 12.257 |
| 0.7645833333333334 | 12.257 |
| 0.7652777777777778 | 12.257 |
| 0.7659722222222222 | 12.257 |
| 0.7666666666666666 | 12.257 |
| 0.7673611111111112 | 12.257 |
| 0.7680555555555556 | 12.257 |
| 0.7687499999999999 | 12.257 |
| 0.7694444444444444 | 12.257 |
| 0.7701388888888889 | 12.257 |
| 0.7708333333333334 | 12.257 |
| 0.7715277777777777 | 12.257 |
| 0.7722222222222223 | 12.257 |
| 0.7729166666666667 | 12.257 |
| 0.7736111111111111 | 12.257 |
| 0.7743055555555555 | 12.257 |
| 0.775 | 12.257 |
| 0.7756944444444445 | 12.257 |
| 0.7763888888888889 | 12.257 |
| 0.7770833333333332 | 12.257 |
| 0.7777777777777778 | 12.257 |
| 0.7784722222222222 | 12.257 |
| 0.7791666666666667 | 12.257 |
| 0.779861111111111 | 16.636 |
| 0.7805555555555556 | 16.636 |
| 0.78125 | 16.636 |
| 0.7819444444444444 | 16.636 |
| 0.782638888888889 | 12.257 |
| 0.7833333333333333 | 12.257 |
| 0.7840277777777778 | 12.257 |
| 0.7847222222222222 | 16.636 |
| 0.7854166666666668 | 16.636 |
| 0.7861111111111111 | 16.636 |
| 0.7868055555555555 | 16.636 |
| 0.7875 | 16.636 |
| 0.7881944444444445 | 16.636 |
| 0.7888888888888889 | 16.636 |
| 0.7895833333333333 | 16.636 |
| 0.7902777777777777 | 16.636 |
| 0.7909722222222223 | 16.636 |
| 0.7916666666666666 | 16.636 |
| 0.7923611111111111 | 16.636 |
| 0.7930555555555556 | 16.636 |
| 0.7937500000000001 | 16.636 |
| 0.7944444444444444 | 12.257 |
| 0.7951388888888888 | 12.257 |
| 0.7958333333333334 | 12.257 |
| 0.7965277777777778 | 12.257 |
| 0.7972222222222222 | 12.257 |
| 0.7979166666666666 | 12.257 |
| 0.7986111111111112 | 7.887 |
| 0.7993055555555556 | 7.887 |
| 0.7999999999999999 | 7.887 |
| 0.8006944444444444 | 7.887 |
| 0.8013888888888889 | 7.887 |
| 0.8020833333333334 | 7.887 |
| 0.8027777777777777 | 7.887 |
| 0.8034722222222223 | 3.525 |
| 0.8041666666666667 | 3.525 |
| 0.8048611111111111 | 3.525 |
| 0.8055555555555555 | 3.525 |
| 0.80625 | 3.525 |
| 0.8069444444444445 | 3.525 |
| 0.8076388888888889 | 3.525 |
| 0.8083333333333332 | 3.525 |
| 0.8090277777777778 | 3.525 |
| 0.8097222222222222 | 3.525 |
| 0.8104166666666667 | 3.525 |
| 0.811111111111111 | 3.525 |
| 0.8118055555555556 | 3.525 |
| 0.8125 | 3.525 |
| 0.8131944444444444 | 3.525 |
| 0.813888888888889 | 3.525 |
| 0.8145833333333333 | 3.525 |
| 0.8152777777777778 | 3.525 |
| 0.8159722222222222 | 7.887 |
| 0.8166666666666668 | 7.887 |
| 0.8173611111111111 | 7.887 |
| 0.8180555555555555 | 7.887 |
| 0.81875 | 7.887 |
| 0.8194444444444445 | 7.887 |
| 0.8201388888888889 | 7.887 |
| 0.8208333333333333 | 7.887 |
| 0.8215277777777777 | 3.525 |
| 0.8222222222222223 | 3.525 |
| 0.8229166666666666 | 3.525 |
| 0.8236111111111111 | 3.525 |
| 0.8243055555555556 | 3.525 |
| 0.8250000000000001 | 3.525 |
| 0.8256944444444444 | 3.525 |
| 0.8263888888888888 | 3.525 |
| 0.8270833333333334 | 3.525 |
| 0.8277777777777778 | 3.525 |
| 0.8284722222222222 | 3.525 |
| 0.8291666666666666 | 3.525 |
| 0.8298611111111112 | 3.525 |
| 0.8305555555555556 | 3.525 |
| 0.8312499999999999 | 3.525 |
| 0.8319444444444444 | 3.525 |
| 0.8326388888888889 | 3.525 |
| 0.8333333333333334 | 3.525 |
| 0.8340277777777777 | 3.525 |
| 0.8347222222222223 | 3.525 |
| 0.8354166666666667 | 0 |
| 0.8361111111111111 | 0 |
| 0.8368055555555555 | 0 |
| 0.8375 | 0 |
| 0.8381944444444445 | 0 |
| 0.8388888888888889 | 0 |
| 0.8395833333333332 | 0 |
| 0.8402777777777778 | 0 |
| 0.8409722222222222 | 0 |
| 0.8416666666666667 | 0 |
| 0.842361111111111 | 0 |
| 0.8430555555555556 | 0 |
| 0.84375 | 0 |
| 0.8444444444444444 | 0 |
| 0.845138888888889 | 0 |
| 0.8458333333333333 | 0 |
| 0.8465277777777778 | 0 |
| 0.8472222222222222 | 0 |
| 0.8479166666666668 | 0 |
| 0.8486111111111111 | 0 |
| 0.8493055555555555 | 0 |
| 0.85 | 0 |
| 0.8506944444444445 | 0 |
| 0.8513888888888889 | 0 |
| 0.8520833333333333 | 0 |
| 0.8527777777777777 | 0 |
| 0.8534722222222223 | 0 |
| 0.8541666666666666 | 0 |
| 0.8548611111111111 | 0 |
| 0.8555555555555556 | 0 |
| 0.8562500000000001 | 0 |
| 0.8569444444444444 | 0 |
| 0.8576388888888888 | 0 |
| 0.8583333333333334 | 0 |
| 0.8590277777777778 | 0 |
| 0.8597222222222222 | 0 |
| 0.8604166666666666 | 0 |
| 0.8611111111111112 | 0 |
| 0.8618055555555556 | 0 |
| 0.8624999999999999 | 0 |
| 0.8631944444444444 | 0 |
| 0.8638888888888889 | 0 |
| 0.8645833333333334 | 0 |
| 0.8652777777777777 | 0 |
| 0.8659722222222223 | 0 |
| 0.8666666666666667 | 0 |
| 0.8673611111111111 | 0 |
| 0.8680555555555555 | 0 |
| 0.86875 | 0 |
| 0.8694444444444445 | 0 |
| 0.8701388888888889 | 0 |
| 0.8708333333333332 | 0 |
| 0.8715277777777778 | 0 |
| 0.8722222222222222 | 0 |
| 0.8729166666666667 | 0 |
| 0.873611111111111 | 0 |
| 0.8743055555555556 | 0 |
| 0.875 | 0 |
| 0.8756944444444444 | 0 |
| 0.876388888888889 | 0 |
| 0.8770833333333333 | 0 |
| 0.8777777777777778 | 0 |
| 0.8784722222222222 | 0 |
| 0.8791666666666668 | 0 |
| 0.8798611111111111 | 0 |
| 0.8805555555555555 | 0 |
| 0.88125 | 0 |
| 0.8819444444444445 | 0 |
| 0.8826388888888889 | 0 |
| 0.8833333333333333 | 0 |
| 0.8840277777777777 | 0 |
| 0.8847222222222223 | 0 |
| 0.8854166666666666 | 0 |
| 0.8861111111111111 | 0 |
| 0.8868055555555556 | 0 |
| 0.8875000000000001 | 0 |
| 0.8881944444444444 | 0 |
| 0.8888888888888888 | 0 |
| 0.8895833333333334 | 0 |
| 0.8902777777777778 | 0 |
| 0.8909722222222222 | 0 |
| 0.8916666666666666 | 0 |
| 0.8923611111111112 | 0 |
| 0.8930555555555556 | 0 |
| 0.8937499999999999 | 0 |
| 0.8944444444444444 | 0 |
| 0.8951388888888889 | 0 |
| 0.8958333333333334 | 0 |
| 0.8965277777777777 | 0 |
| 0.8972222222222223 | 0 |
| 0.8979166666666667 | 0 |
| 0.8986111111111111 | 0 |
| 0.8993055555555555 | 0 |
| 0.9 | 0 |
| 0.9006944444444445 | 0 |
| 0.9013888888888889 | 0 |
| 0.9020833333333332 | 0 |
| 0.9027777777777778 | 0 |
| 0.9034722222222222 | 0 |
| 0.9041666666666667 | 0 |
| 0.904861111111111 | 0 |
| 0.9055555555555556 | 0 |
| 0.90625 | 0 |
| 0.9069444444444444 | 0 |
| 0.907638888888889 | 0 |
| 0.9083333333333333 | 0 |
| 0.9090277777777778 | 0 |
| 0.9097222222222222 | 0 |
| 0.9104166666666668 | 0 |
| 0.9111111111111111 | 0 |
| 0.9118055555555555 | 0 |
| 0.9125 | 0 |
| 0.9131944444444445 | 0 |
| 0.9138888888888889 | 0 |
| 0.9145833333333333 | 0 |
| 0.9152777777777777 | 0 |
| 0.9159722222222223 | 0 |
| 0.9166666666666666 | 0 |
| 0.9173611111111111 | 0 |
| 0.9180555555555556 | 0 |
| 0.9187500000000001 | 0 |
| 0.9194444444444444 | 0 |
| 0.9201388888888888 | 0 |
| 0.9208333333333334 | 0 |
| 0.9215277777777778 | 0 |
| 0.9222222222222222 | 0 |
| 0.9229166666666666 | 0 |
| 0.9236111111111112 | 0 |
| 0.9243055555555556 | 0 |
| 0.9249999999999999 | 0 |
| 0.9256944444444444 | 0 |
| 0.9263888888888889 | 0 |
| 0.9270833333333334 | 0 |
| 0.9277777777777777 | 0 |
| 0.9284722222222223 | 0 |
| 0.9291666666666667 | 0 |
| 0.9298611111111111 | 0 |
| 0.9305555555555555 | 0 |
| 0.93125 | 0 |
| 0.9319444444444445 | 0 |
| 0.9326388888888889 | 0 |
| 0.9333333333333332 | 0 |
| 0.9340277777777778 | 0 |
| 0.9347222222222222 | 0 |
| 0.9354166666666667 | 0 |
| 0.936111111111111 | 0 |
| 0.9368055555555556 | 0 |
| 0.9375 | 0 |
| 0.9381944444444444 | 0 |
| 0.938888888888889 | 0 |
| 0.9395833333333333 | 0 |
| 0.9402777777777778 | 0 |
| 0.9409722222222222 | 0 |
| 0.9416666666666668 | 0 |
| 0.9423611111111111 | 0 |
| 0.9430555555555555 | 0 |
| 0.94375 | 0 |
| 0.9444444444444445 | 0 |
| 0.9451388888888889 | 0 |
| 0.9458333333333333 | 0 |
| 0.9465277777777777 | 0 |
| 0.9472222222222223 | 0 |
| 0.9479166666666666 | 0 |
| 0.9486111111111111 | 0 |
| 0.9493055555555556 | 0 |
| 0.9500000000000001 | 0 |
| 0.9506944444444444 | 0 |
| 0.9513888888888888 | 0 |
| 0.9520833333333334 | 0 |
| 0.9527777777777778 | 0 |
| 0.9534722222222222 | 0 |
| 0.9541666666666666 | 0 |
| 0.9548611111111112 | 0 |
| 0.9555555555555556 | 0 |
| 0.9562499999999999 | 0 |
| 0.9569444444444444 | 0 |
| 0.9576388888888889 | 0 |
| 0.9583333333333334 | 0 |
| 0.9590277777777777 | 0 |
| 0.9597222222222223 | 0 |
| 0.9604166666666667 | 0 |
| 0.9611111111111111 | 0 |
| 0.9618055555555555 | 0 |
| 0.9625 | 0 |
| 0.9631944444444445 | 0 |
| 0.9638888888888889 | 0 |
| 0.9645833333333332 | 0 |
| 0.9652777777777778 | 0 |
| 0.9659722222222222 | 0 |
| 0.9666666666666667 | 0 |
| 0.967361111111111 | 0 |
| 0.9680555555555556 | 0 |
| 0.96875 | 0 |
| 0.9694444444444444 | 0 |
| 0.970138888888889 | 0 |
| 0.9708333333333333 | 0 |
| 0.9715277777777778 | 0 |
| 0.9722222222222222 | 0 |
| 0.9729166666666668 | 0 |
| 0.9736111111111111 | 0 |
| 0.9743055555555555 | 0 |
| 0.975 | 0 |
| 0.9756944444444445 | 0 |
| 0.9763888888888889 | 0 |
| 0.9770833333333333 | 0 |
| 0.9777777777777777 | 0 |
| 0.9784722222222223 | 0 |
| 0.9791666666666666 | 0 |
| 0.9798611111111111 | 0 |
| 0.9805555555555556 | 0 |
| 0.9812500000000001 | 0 |
| 0.9819444444444444 | 0 |
| 0.9826388888888888 | 0 |
| 0.9833333333333334 | 0 |
| 0.9840277777777778 | 0 |
| 0.9847222222222222 | 0 |
| 0.9854166666666666 | 0 |
| 0.9861111111111112 | 0 |
| 0.9868055555555556 | 0 |
| 0.9874999999999999 | 0 |
| 0.9881944444444444 | 0 |
| 0.9888888888888889 | 0 |
| 0.9895833333333334 | 0 |
| 0.9902777777777777 | 0 |
| 0.9909722222222223 | 0 |
| 0.9916666666666667 | 0 |
| 0.9923611111111111 | 0 |
| 0.9930555555555555 | 0 |
| 0.99375 | 0 |
| 0.9944444444444445 | 0 |
| 0.9951388888888889 | 0 |
| 0.9958333333333332 | 0 |
| 0.9965277777777778 | 0 |
| 0.9972222222222222 | 0 |
| 0.9979166666666667 | 0 |
| 0.998611111111111 | 0 |
| 0.9993055555555556 | 0 |